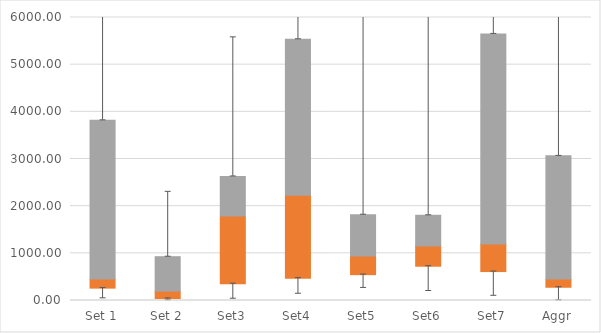
| Category | Q1 | Median-Q1 | Q3-Median |
|---|---|---|---|
| Set 1 | 262.42 | 191.104 | 3366.661 |
| Set 2 | 42.812 | 155.188 | 730.897 |
| Set3 | 356.171 | 1433.594 | 841.4 |
| Set4 | 473.745 | 1756.865 | 3308.53 |
| Set5 | 548.408 | 396.731 | 874.457 |
| Set6 | 726.524 | 429.524 | 650.877 |
| Set7 | 613.546 | 582.553 | 4456.704 |
| Aggr | 280.866 | 172.657 | 2613.06 |